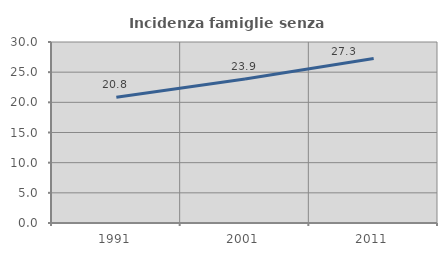
| Category | Incidenza famiglie senza nuclei |
|---|---|
| 1991.0 | 20.843 |
| 2001.0 | 23.859 |
| 2011.0 | 27.26 |